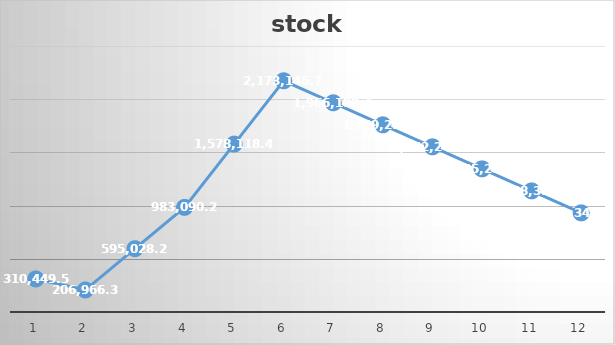
| Category | stock |
|---|---|
| 1.0 | 310449.53 |
| 2.0 | 206966.35 |
| 3.0 | 595028.28 |
| 4.0 | 983090.2 |
| 5.0 | 1578118.48 |
| 6.0 | 2173146.76 |
| 7.0 | 1966180.4 |
| 8.0 | 1759214.05 |
| 9.0 | 1552247.69 |
| 10.0 | 1345281.33 |
| 11.0 | 1138314.97 |
| 12.0 | 931348.61 |